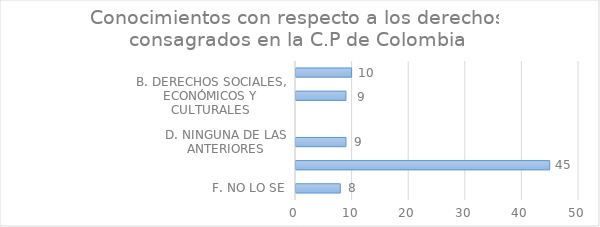
| Category | Series 0 |
|---|---|
| F. NO LO SE | 8 |
| E. TODAS LAS ANTERIORES | 45 |
| D. NINGUNA DE LAS ANTERIORES | 9 |
| C. DERECHOS COLECTIVOS Y DEL AMBIENTE | 0 |
| B. DERECHOS SOCIALES, ECONÓMICOS Y CULTURALES | 9 |
| A. DERECHOS FUNDAMENTALES | 10 |